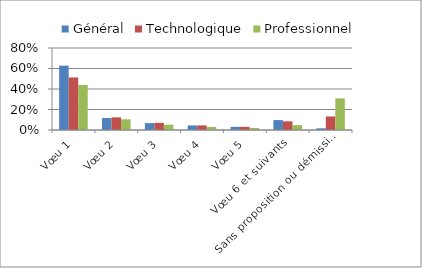
| Category | Général | Technologique | Professionnel |
|---|---|---|---|
| Vœu 1 | 0.627 | 0.513 | 0.44 |
| Vœu 2 | 0.117 | 0.123 | 0.104 |
| Vœu 3 | 0.067 | 0.07 | 0.051 |
| Vœu 4 | 0.045 | 0.045 | 0.03 |
| Vœu 5 | 0.031 | 0.032 | 0.019 |
| Vœu 6 et suivants | 0.097 | 0.085 | 0.047 |
| Sans proposition ou démission | 0.017 | 0.132 | 0.308 |